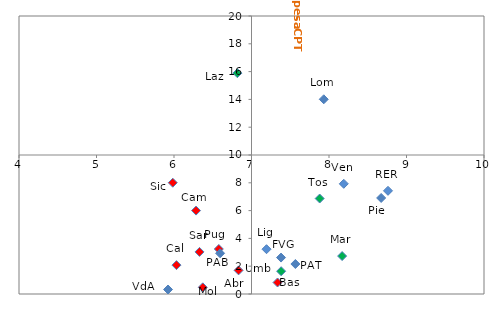
| Category | Series 0 |
|---|---|
| 8.673028817790813 | 6.909 |
| 5.922882629179516 | 0.324 |
| 7.9323521921443145 | 14.007 |
| 8.190776054219073 | 7.928 |
| 7.381129505587654 | 2.62 |
| 7.193832063273493 | 3.222 |
| 8.76127629715152 | 7.422 |
| 7.879950673522341 | 6.869 |
| 7.382494406518329 | 1.639 |
| 8.169420675064222 | 2.729 |
| 6.817704933230289 | 15.887 |
| 6.833465758808928 | 1.702 |
| 6.371309475853255 | 0.48 |
| 6.284393617349127 | 6.001 |
| 6.578189041181537 | 3.238 |
| 7.335586186579427 | 0.827 |
| 6.031976879646997 | 2.077 |
| 5.983966453842886 | 8.004 |
| 6.329170237482337 | 3.027 |
| 7.566298718076741 | 2.157 |
| 6.594568685748805 | 2.929 |